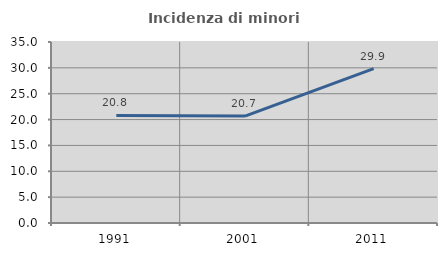
| Category | Incidenza di minori stranieri |
|---|---|
| 1991.0 | 20.792 |
| 2001.0 | 20.677 |
| 2011.0 | 29.851 |